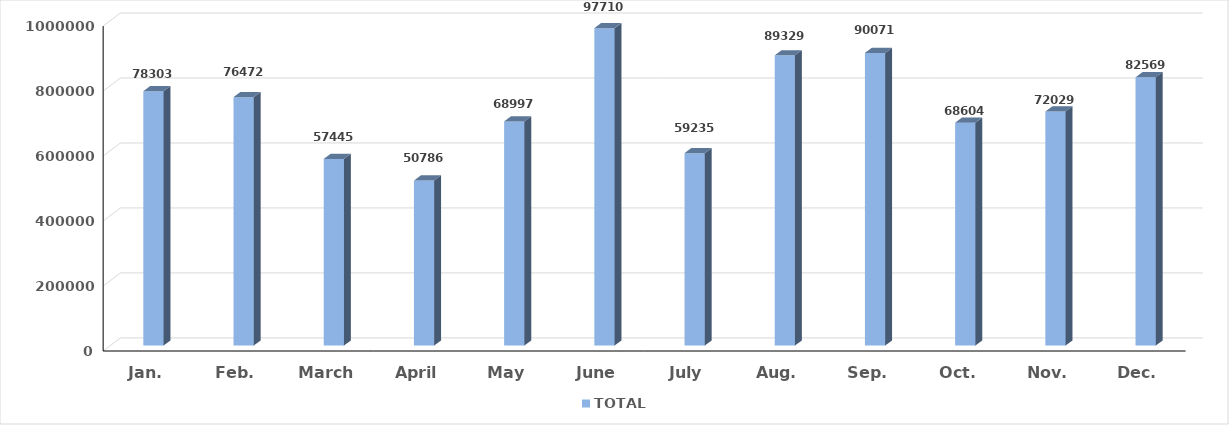
| Category | TOTAL |
|---|---|
| Jan. | 783032 |
| Feb. | 764726 |
| March | 574457 |
| April | 507865 |
| May | 689973 |
| June | 977105 |
| July | 592353 |
| Aug. | 893298 |
| Sep. | 900716 |
| Oct. | 686048 |
| Nov. | 720297 |
| Dec. | 825690 |